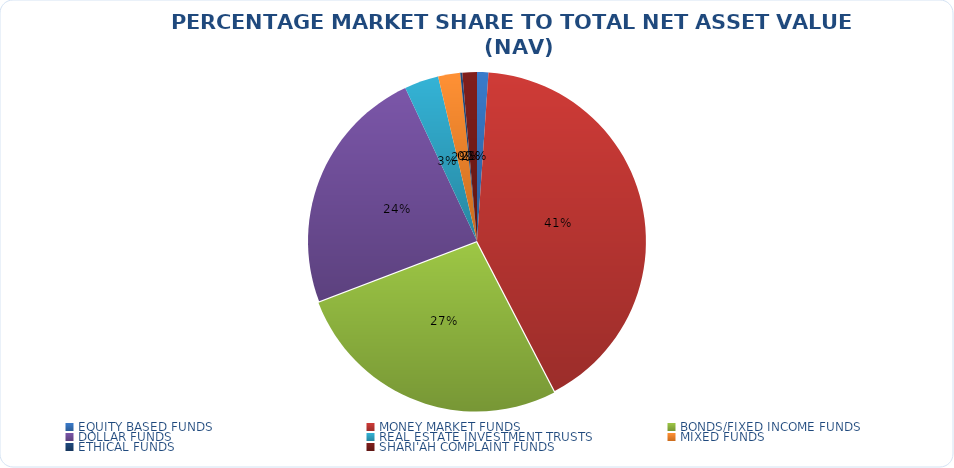
| Category | NET ASSET VALUE |
|---|---|
| EQUITY BASED FUNDS | 15198855674.76 |
| MONEY MARKET FUNDS | 577863614226.846 |
| BONDS/FIXED INCOME FUNDS | 375145141203.628 |
| DOLLAR FUNDS | 333341872663.592 |
| REAL ESTATE INVESTMENT TRUSTS | 45836329909.32 |
| MIXED FUNDS | 29488176136.81 |
| ETHICAL FUNDS | 2818765809.26 |
| SHARI'AH COMPLAINT FUNDS | 19407822854.6 |